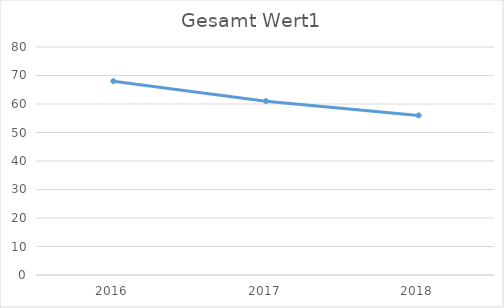
| Category | Gesamt Wert1 |
|---|---|
| 2016.0 | 68 |
| 2017.0 | 61 |
| 2018.0 | 56 |